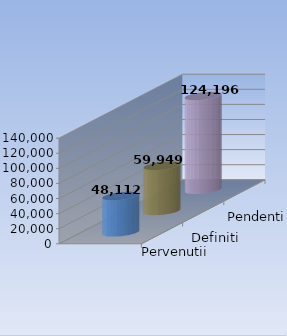
| Category | Pervenutii | Definiti | Pendenti |
|---|---|---|---|
| 0 | 48112 | 59949 | 124196 |